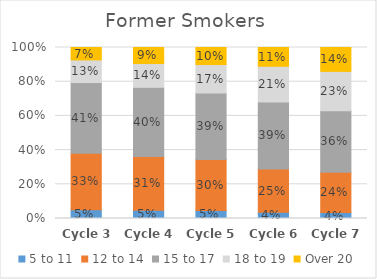
| Category | 5 to 11 | 12 to 14 | 15 to 17 | 18 to 19 | Over 20 |
|---|---|---|---|---|---|
| Cycle 3 | 0.051 | 0.331 | 0.413 | 0.132 | 0.073 |
| Cycle 4 | 0.049 | 0.315 | 0.404 | 0.139 | 0.094 |
| Cycle 5 | 0.048 | 0.298 | 0.389 | 0.166 | 0.1 |
| Cycle 6 | 0.036 | 0.253 | 0.393 | 0.208 | 0.11 |
| Cycle 7 | 0.035 | 0.236 | 0.36 | 0.229 | 0.14 |